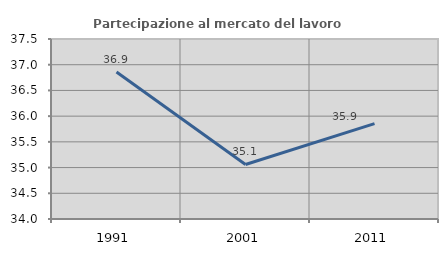
| Category | Partecipazione al mercato del lavoro  femminile |
|---|---|
| 1991.0 | 36.859 |
| 2001.0 | 35.06 |
| 2011.0 | 35.855 |